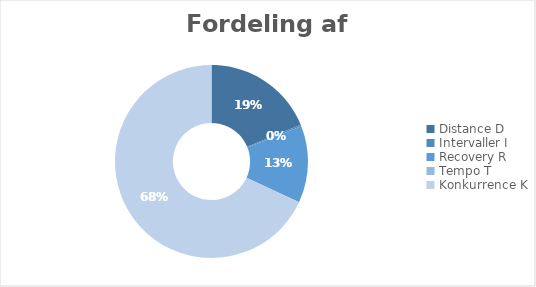
| Category | Total |
|---|---|
| 0 | 364.39 |
| 1 | 5.16 |
| 2 | 249.82 |
| 3 | 0 |
| 4 | 1321.23 |